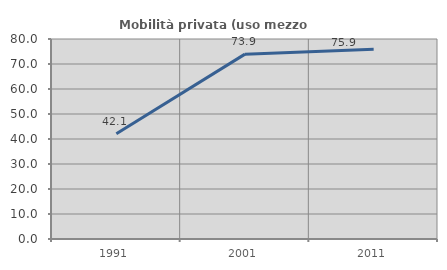
| Category | Mobilità privata (uso mezzo privato) |
|---|---|
| 1991.0 | 42.138 |
| 2001.0 | 73.944 |
| 2011.0 | 75.862 |